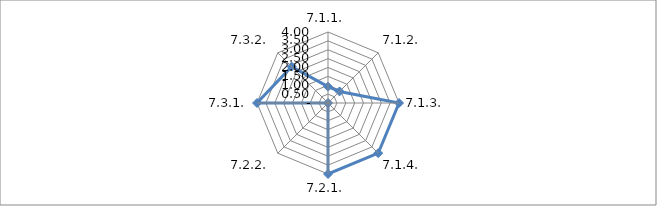
| Category | Series 0 |
|---|---|
| 7.1.1. | 0.92 |
| 7.1.2. | 0.92 |
| 7.1.3. | 4 |
| 7.1.4. | 4 |
| 7.2.1. | 4 |
| 7.2.2. | 0 |
| 7.3.1. | 4 |
| 7.3.2. | 2.9 |